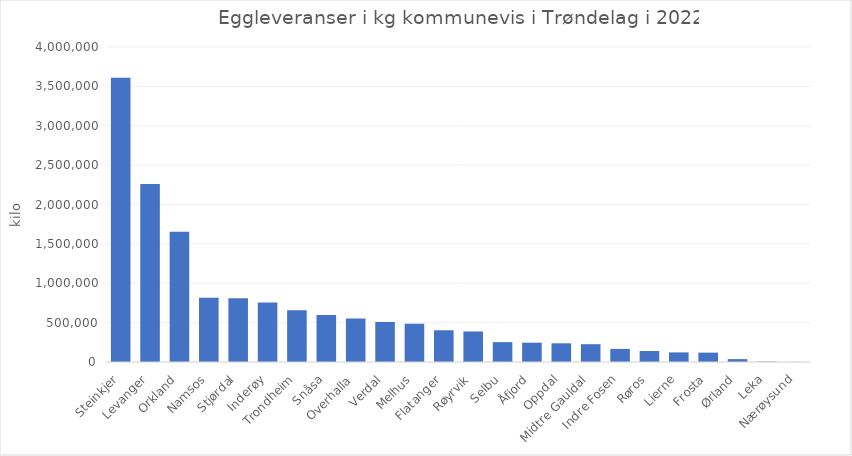
| Category | Totalt |
|---|---|
| Steinkjer | 3609703 |
| Levanger | 2259191 |
| Orkland | 1654246 |
| Namsos | 814494 |
| Stjørdal | 808249 |
| Inderøy | 754368 |
| Trondheim | 655610 |
| Snåsa | 597803 |
| Overhalla | 552154 |
| Verdal | 508705 |
| Melhus | 485997 |
| Flatanger | 402944 |
| Røyrvik | 387782 |
| Selbu | 252171 |
| Åfjord | 245391 |
| Oppdal | 237268 |
| Midtre Gauldal | 226175 |
| Indre Fosen | 166028 |
| Røros | 139430 |
| Lierne | 121881 |
| Frosta | 118836 |
| Ørland | 36468 |
| Leka | 5589 |
| Nærøysund | 1366 |